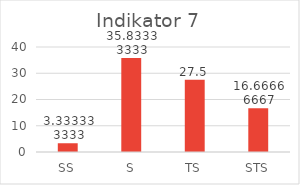
| Category | Series 0 |
|---|---|
| 0 | 3.333 |
| 1 | 35.833 |
| 2 | 27.5 |
| 3 | 16.667 |